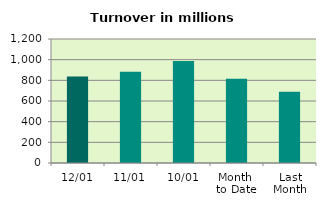
| Category | Series 0 |
|---|---|
| 12/01 | 836.223 |
| 11/01 | 883.687 |
| 10/01 | 987.684 |
| Month 
to Date | 815.17 |
| Last
Month | 689.27 |